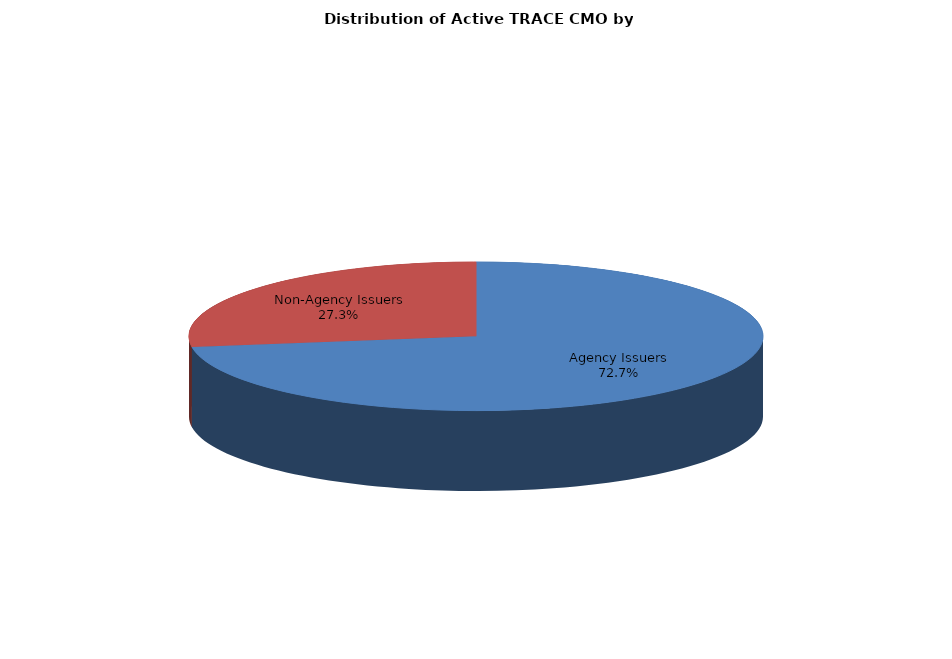
| Category | Series 0 |
|---|---|
| Agency Issuers | 262296 |
| Non-Agency Issuers | 98414 |